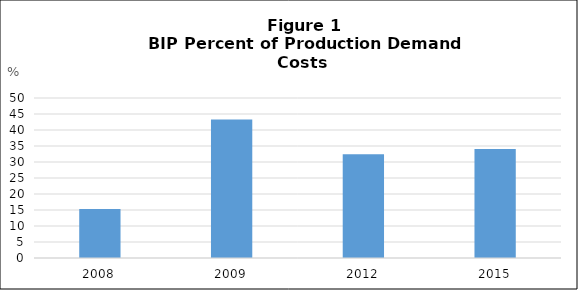
| Category | % Costs Assigned to Winter |
|---|---|
| 2008.0 | 15.32 |
| 2009.0 | 43.3 |
| 2012.0 | 32.39 |
| 2015.0 | 34.1 |